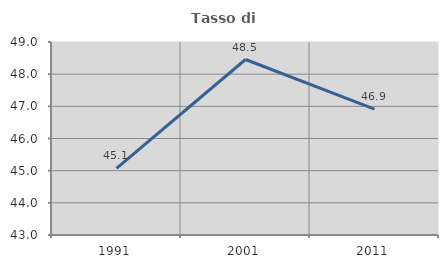
| Category | Tasso di occupazione   |
|---|---|
| 1991.0 | 45.073 |
| 2001.0 | 48.455 |
| 2011.0 | 46.912 |